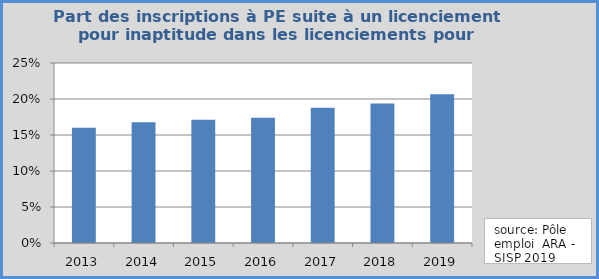
| Category | Part des inscriptions suite à un licenciement pour inaptitude dans les licenciements pour motif personnel |
|---|---|
| 2013.0 | 0.16 |
| 2014.0 | 0.168 |
| 2015.0 | 0.171 |
| 2016.0 | 0.174 |
| 2017.0 | 0.188 |
| 2018.0 | 0.194 |
| 2019.0 | 0.207 |